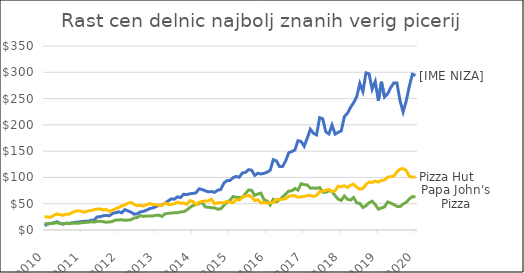
| Category | Domino's Pizza | Papa John's Pizza | Pizza Hut |
|---|---|---|---|
| 2010-01-01 | 8.53 | 11.845 | 25.248 |
| 2010-02-01 | 11.38 | 11.805 | 24.766 |
| 2010-03-01 | 12.62 | 12.21 | 24.277 |
| 2010-04-01 | 13.74 | 12.89 | 27.664 |
| 2010-05-01 | 15.59 | 13.72 | 30.647 |
| 2010-06-01 | 12.96 | 12.415 | 29.31 |
| 2010-07-01 | 11.2 | 11.545 | 28.001 |
| 2010-08-01 | 13.04 | 12.78 | 30.043 |
| 2010-09-01 | 12.92 | 12.055 | 30.194 |
| 2010-10-01 | 13.27 | 13.31 | 33.293 |
| 2010-11-01 | 14.95 | 12.995 | 35.873 |
| 2010-12-01 | 14.97 | 12.845 | 36.542 |
| 2011-01-01 | 16.1 | 13.95 | 35.442 |
| 2011-02-01 | 16.5 | 14.4 | 33.738 |
| 2011-03-01 | 16.49 | 14.615 | 36.362 |
| 2011-04-01 | 18.5 | 15.875 | 37.009 |
| 2011-05-01 | 18.58 | 15 | 38.67 |
| 2011-06-01 | 24.85 | 16.61 | 39.756 |
| 2011-07-01 | 25.25 | 16.655 | 39.748 |
| 2011-08-01 | 27.14 | 15.695 | 38.382 |
| 2011-09-01 | 27.65 | 14.85 | 39.058 |
| 2011-10-01 | 27.16 | 15.125 | 35.421 |
| 2011-11-01 | 31.36 | 16.43 | 37.75 |
| 2011-12-01 | 32.77 | 19.105 | 40.331 |
| 2012-01-01 | 34.58 | 19.225 | 42.854 |
| 2012-02-01 | 32.7 | 19.355 | 45.83 |
| 2012-03-01 | 38.76 | 18.61 | 47.613 |
| 2012-04-01 | 36.3 | 18.805 | 51.114 |
| 2012-05-01 | 33.81 | 19.66 | 52.495 |
| 2012-06-01 | 30.07 | 22.975 | 48.699 |
| 2012-07-01 | 30.95 | 23.79 | 46.204 |
| 2012-08-01 | 34.52 | 27.5 | 46.858 |
| 2012-09-01 | 35.38 | 25.75 | 45.636 |
| 2012-10-01 | 37.74 | 26.73 | 48.023 |
| 2012-11-01 | 40.73 | 26.545 | 50.381 |
| 2012-12-01 | 41.94 | 26.6 | 48.253 |
| 2013-01-01 | 44.18 | 28.005 | 48.526 |
| 2013-02-01 | 46.91 | 28.195 | 46.887 |
| 2013-03-01 | 47.49 | 25.84 | 46.65 |
| 2013-04-01 | 51.44 | 30.84 | 51.711 |
| 2013-05-01 | 55.22 | 31.61 | 48.735 |
| 2013-06-01 | 59.19 | 32.21 | 48.735 |
| 2013-07-01 | 58.6 | 32.85 | 50.036 |
| 2013-08-01 | 63 | 32.8 | 52.84 |
| 2013-09-01 | 61.62 | 34.39 | 50.855 |
| 2013-10-01 | 68.12 | 34.775 | 51.459 |
| 2013-11-01 | 67.19 | 37.905 | 48.605 |
| 2013-12-01 | 68.94 | 42.71 | 55.758 |
| 2014-01-01 | 69.65 | 46.51 | 54.191 |
| 2014-02-01 | 70.69 | 48.2 | 48.426 |
| 2014-03-01 | 78.28 | 50.38 | 52.725 |
| 2014-04-01 | 77 | 52.32 | 54.285 |
| 2014-05-01 | 74.58 | 43.81 | 55.298 |
| 2014-06-01 | 72.59 | 43.3 | 55.327 |
| 2014-07-01 | 73.24 | 42.39 | 58.677 |
| 2014-08-01 | 71.6 | 42.03 | 49.942 |
| 2014-09-01 | 75.65 | 39.61 | 51.761 |
| 2014-10-01 | 76.9 | 40.18 | 51.711 |
| 2014-11-01 | 89.15 | 46.61 | 51.56 |
| 2014-12-01 | 93.79 | 52.9 | 54.357 |
| 2015-01-01 | 94.3 | 56.35 | 52.797 |
| 2015-02-01 | 99.6 | 63.6 | 52.078 |
| 2015-03-01 | 101.91 | 62.09 | 58.231 |
| 2015-04-01 | 100.28 | 61.85 | 56.542 |
| 2015-05-01 | 108.56 | 61.74 | 62.185 |
| 2015-06-01 | 109.58 | 69.17 | 64.601 |
| 2015-07-01 | 114.77 | 76.23 | 65.5 |
| 2015-08-01 | 113.84 | 75.38 | 63.293 |
| 2015-09-01 | 103.76 | 65.84 | 55.787 |
| 2015-10-01 | 107.99 | 68.49 | 57.52 |
| 2015-11-01 | 106.55 | 69.99 | 51.301 |
| 2015-12-01 | 107.71 | 57.59 | 52.624 |
| 2016-01-01 | 109.96 | 54.97 | 51.272 |
| 2016-02-01 | 113.55 | 47.59 | 51.704 |
| 2016-03-01 | 133.76 | 58.34 | 52.401 |
| 2016-04-01 | 131.49 | 53.78 | 58.145 |
| 2016-05-01 | 120.92 | 56.81 | 57.642 |
| 2016-06-01 | 120.6 | 63.02 | 58.663 |
| 2016-07-01 | 131.45 | 68.06 | 59.633 |
| 2016-08-01 | 146.94 | 74.02 | 64.134 |
| 2016-09-01 | 149.17 | 74.6 | 65.119 |
| 2016-10-01 | 152.12 | 79.03 | 65.284 |
| 2016-11-01 | 169.85 | 75.8 | 62.21 |
| 2016-12-01 | 168.38 | 87.97 | 63.44 |
| 2017-01-01 | 159.22 | 86.21 | 63.56 |
| 2017-02-01 | 174.81 | 85.66 | 65.48 |
| 2017-03-01 | 191.64 | 79.48 | 65.9 |
| 2017-04-01 | 184.07 | 80.03 | 63.74 |
| 2017-05-01 | 181 | 79.11 | 65.72 |
| 2017-06-01 | 213.78 | 80.8 | 72.64 |
| 2017-07-01 | 211.55 | 71.89 | 73.6 |
| 2017-08-01 | 186.72 | 71.83 | 75.82 |
| 2017-09-01 | 182.89 | 74.78 | 76.99 |
| 2017-10-01 | 199.79 | 73.08 | 73.37 |
| 2017-11-01 | 182.32 | 65.5 | 74.54 |
| 2017-12-01 | 185.78 | 58.58 | 83.46 |
| 2018-01-01 | 188.52 | 56.29 | 82.15 |
| 2018-02-01 | 215.7 | 64.71 | 84.24 |
| 2018-03-01 | 222 | 58.46 | 80.98 |
| 2018-04-01 | 233.29 | 56.99 | 85.22 |
| 2018-05-01 | 242.15 | 61.85 | 87.11 |
| 2018-06-01 | 253.42 | 51.57 | 81.64 |
| 2018-07-01 | 278.64 | 50.47 | 77.52 |
| 2018-08-01 | 263.5 | 42.76 | 78.95 |
| 2018-09-01 | 298.9 | 46.14 | 86.74 |
| 2018-10-01 | 296.86 | 51.79 | 91.05 |
| 2018-11-01 | 267.85 | 54.83 | 90.48 |
| 2018-12-01 | 282.44 | 48.35 | 93.24 |
| 2019-01-01 | 245.59 | 39.64 | 91.09 |
| 2019-02-01 | 281.92 | 41.83 | 94.49 |
| 2019-03-01 | 253.12 | 44.07 | 95 |
| 2019-04-01 | 258.71 | 53.45 | 100.43 |
| 2019-05-01 | 271 | 51.31 | 101.5 |
| 2019-06-01 | 279.7 | 48.35 | 102.24 |
| 2019-07-01 | 279.58 | 44.93 | 110.46 |
| 2019-08-01 | 246.12 | 44.33 | 116.15 |
| 2019-09-01 | 224.57 | 49.32 | 116.8 |
| 2019-10-01 | 245.13 | 52.67 | 113.4 |
| 2019-11-01 | 272.93 | 58.97 | 101.93 |
| 2019-12-01 | 296.26 | 63.58 | 100.71 |
| 2020-01-01 | 293.79 | 62.89 | 100.9 |